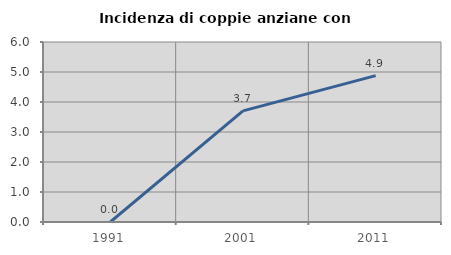
| Category | Incidenza di coppie anziane con figli |
|---|---|
| 1991.0 | 0 |
| 2001.0 | 3.704 |
| 2011.0 | 4.878 |